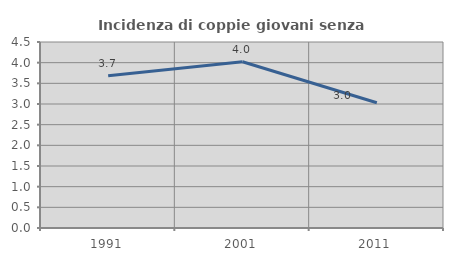
| Category | Incidenza di coppie giovani senza figli |
|---|---|
| 1991.0 | 3.684 |
| 2001.0 | 4.023 |
| 2011.0 | 3.03 |